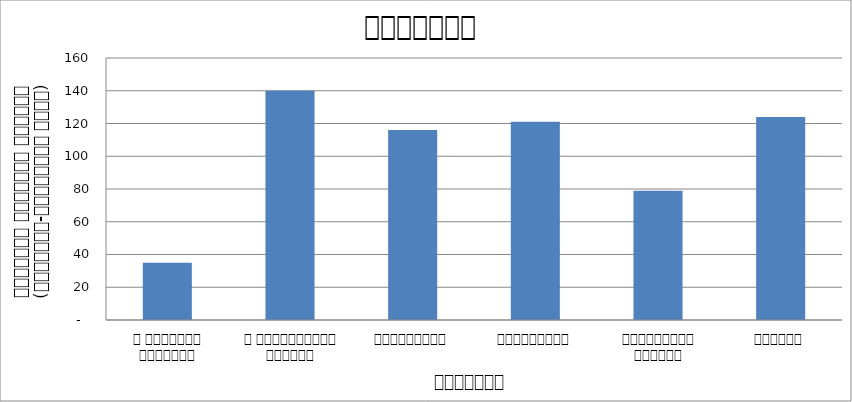
| Category | राजनीति |
|---|---|
| द हिमालयन टाइम्स् | 35 |
| द काठमाण्डौं पोस्ट् | 140 |
| रिपब्लिका | 116 |
| कान्तिपुर | 121 |
| अन्नपूर्ण पोस्ट् | 79 |
| नागरिक | 124 |